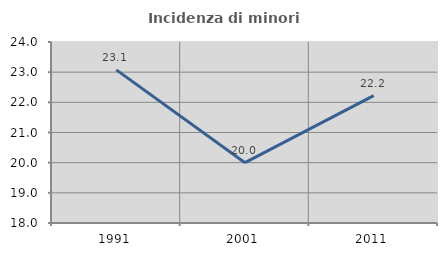
| Category | Incidenza di minori stranieri |
|---|---|
| 1991.0 | 23.077 |
| 2001.0 | 20 |
| 2011.0 | 22.222 |